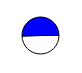
| Category | Series 0 |
|---|---|
| 0 | 35000 |
| 1 | 35656 |